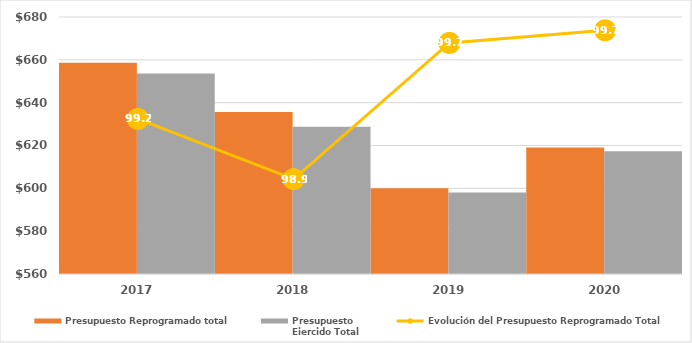
| Category | Presupuesto Reprogramado total | Presupuesto
Ejercido Total |
|---|---|---|
| 2017.0 | 658646.191 | 653670.792 |
| 2018.0 | 635684.884 | 628799.563 |
| 2019.0 | 600089.527 | 598040.902 |
| 2020.0 | 619034.656 | 617347.742 |